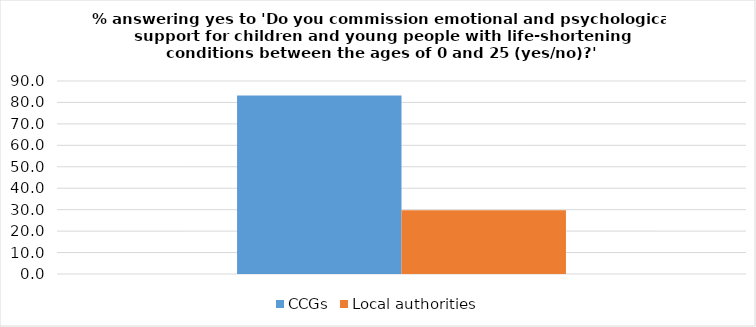
| Category | CCGs | Local authorities |
|---|---|---|
| 0 | 83.24 | 29.688 |